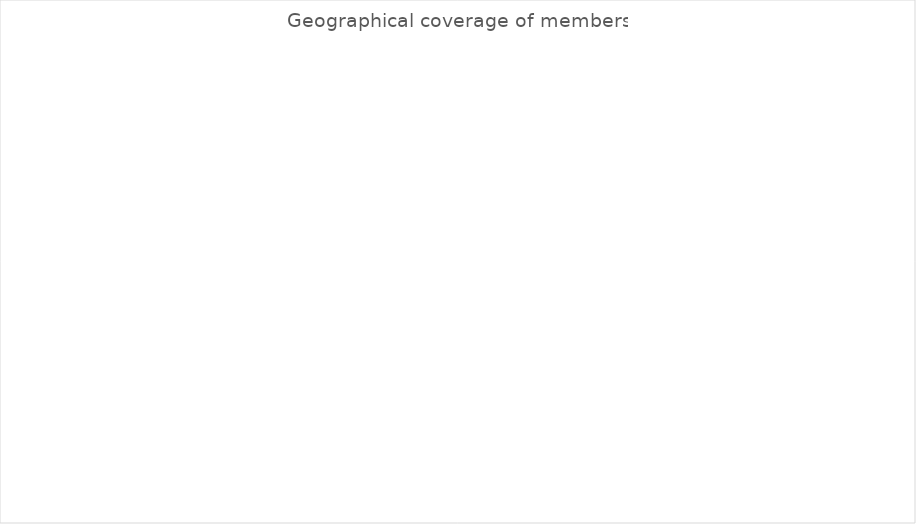
| Category | Series 2 |
|---|---|
| Number of EU countries | 0 |
| Number of EFTA countries | 0 |
| Number of acceding countries, candidate countries and potential candidates | 0 |
| Number of European Neighbourhood Policy countries | 0 |
| Number of third countries | 0 |